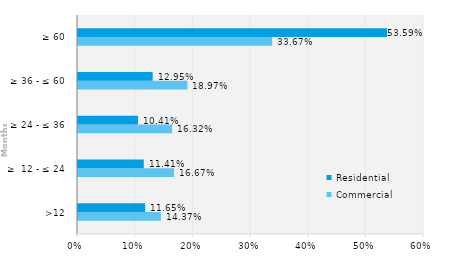
| Category | Commercial | Residential |
|---|---|---|
| >12 | 0.144 | 0.117 |
| ≥  12 - ≤ 24 | 0.167 | 0.114 |
| ≥ 24 - ≤ 36 | 0.163 | 0.104 |
| ≥ 36 - ≤ 60 | 0.19 | 0.13 |
| ≥ 60 | 0.337 | 0.536 |